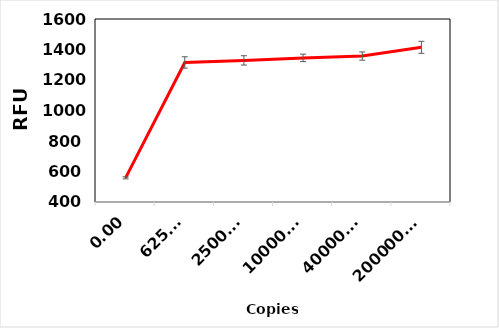
| Category | RFU |
|---|---|
| 0.0 | 558.333 |
| 625.0 | 1315 |
| 2500.0 | 1328.667 |
| 10000.0 | 1345 |
| 40000.0 | 1357 |
| 200000.0 | 1414.333 |